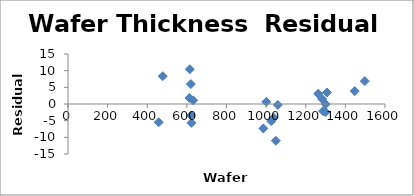
| Category | Series 0 |
|---|---|
| 1059.0 | -0.282 |
| 1049.0 | -11.035 |
| 1039.0 | -4.122 |
| 1026.0 | -5.12 |
| 1001.0 | 0.627 |
| 986.0 | -7.328 |
| 1447.0 | 3.872 |
| 458.0 | -5.467 |
| 1263.0 | 3.074 |
| 1283.0 | 1.5 |
| 1301.0 | -0.066 |
| 1287.0 | -2.13 |
| 1300.0 | -2.416 |
| 1307.0 | 3.458 |
| 632.0 | 1.085 |
| 621.0 | -3.433 |
| 623.0 | -5.646 |
| 620.0 | 5.974 |
| 613.0 | 1.819 |
| 615.0 | 10.437 |
| 478.0 | 8.326 |
| 1498.0 | 6.875 |